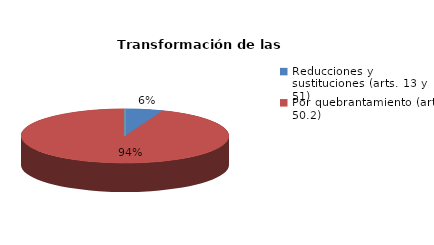
| Category | Series 0 |
|---|---|
| Reducciones y sustituciones (arts. 13 y 51) | 2 |
| Por quebrantamiento (art. 50.2) | 32 |
| Cancelaciones anticipadas | 0 |
| Traslado a Centros Penitenciarios | 0 |
| Conversión internamientos en cerrados (art. 51.2) | 0 |